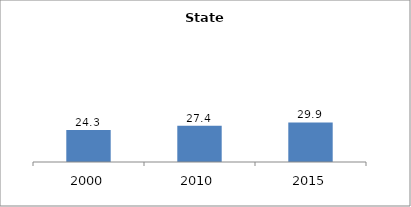
| Category | Series 0 |
|---|---|
| 2000.0 | 24.3 |
| 2010.0 | 27.382 |
| 2015.0 | 29.925 |